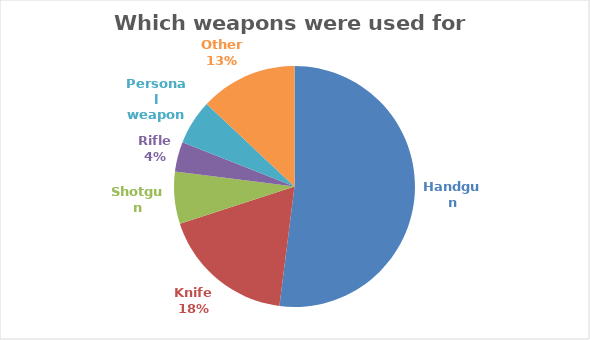
| Category | Series 0 |
|---|---|
| Handgun | 52 |
| Knife | 18 |
| Shotgun | 7 |
| Rifle | 4 |
| Personal weapon | 6 |
| Other | 13 |